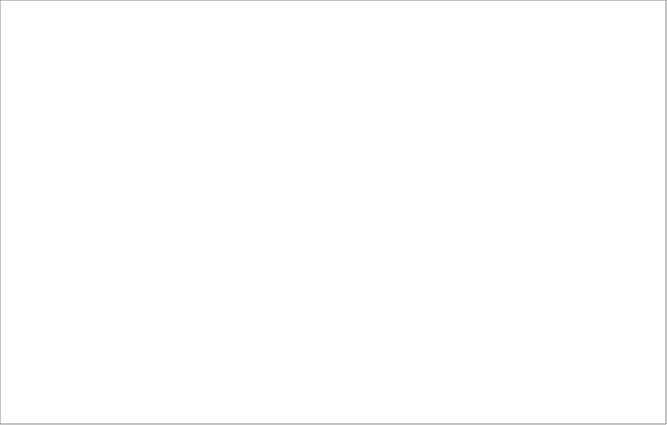
| Category | 2004 | 2005 | 2006 | 2008 | 2009 | 2010 | 2011 | 2012 | 2013 |
|---|---|---|---|---|---|---|---|---|---|
| mazowieckie | 332 | 353 | 496 | 209 | 165 | 119 | 104 | 107 | 101 |